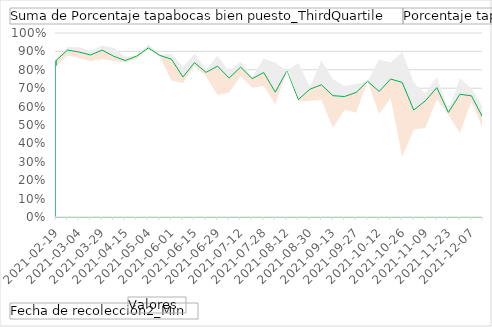
| Category | Suma de Porcentaje tapabocas bien puesto_ThirdQuartile | Porcentaje tapabocas bien puesto. | Suma de Porcentaje tapabocas bien puesto_FirstQuartile |
|---|---|---|---|
| 2021-02-19 | 0.855 | 0.851 | 0.819 |
| 2021-02-23 | 0.924 | 0.907 | 0.878 |
| 2021-03-04 | 0.923 | 0.896 | 0.864 |
| 2021-03-10 | 0.902 | 0.881 | 0.848 |
| 2021-03-29 | 0.93 | 0.907 | 0.86 |
| 2021-04-06 | 0.92 | 0.874 | 0.848 |
| 2021-04-15 | 0.871 | 0.85 | 0.842 |
| 2021-04-20 | 0.877 | 0.875 | 0.859 |
| 2021-05-04 | 0.939 | 0.919 | 0.912 |
| 2021-05-21 | 0.884 | 0.878 | 0.873 |
| 2021-06-01 | 0.887 | 0.858 | 0.742 |
| 2021-06-08 | 0.816 | 0.761 | 0.728 |
| 2021-06-15 | 0.887 | 0.839 | 0.821 |
| 2021-06-21 | 0.802 | 0.786 | 0.765 |
| 2021-06-29 | 0.877 | 0.82 | 0.663 |
| 2021-07-06 | 0.792 | 0.755 | 0.677 |
| 2021-07-12 | 0.844 | 0.815 | 0.767 |
| 2021-07-19 | 0.759 | 0.752 | 0.702 |
| 2021-07-28 | 0.86 | 0.785 | 0.713 |
| 2021-08-03 | 0.839 | 0.679 | 0.613 |
| 2021-08-12 | 0.793 | 0.793 | 0.793 |
| 2021-08-17 | 0.837 | 0.638 | 0.628 |
| 2021-08-30 | 0.706 | 0.695 | 0.632 |
| 2021-09-06 | 0.849 | 0.719 | 0.637 |
| 2021-09-13 | 0.748 | 0.659 | 0.483 |
| 2021-09-20 | 0.712 | 0.655 | 0.583 |
| 2021-09-27 | 0.723 | 0.676 | 0.567 |
| 2021-10-06 | 0.738 | 0.738 | 0.738 |
| 2021-10-12 | 0.855 | 0.682 | 0.56 |
| 2021-10-19 | 0.839 | 0.75 | 0.646 |
| 2021-10-26 | 0.896 | 0.731 | 0.327 |
| 2021-11-02 | 0.729 | 0.581 | 0.476 |
| 2021-11-09 | 0.672 | 0.631 | 0.483 |
| 2021-11-17 | 0.761 | 0.703 | 0.639 |
| 2021-11-23 | 0.581 | 0.568 | 0.556 |
| 2021-11-29 | 0.754 | 0.667 | 0.457 |
| 2021-12-07 | 0.698 | 0.659 | 0.628 |
| 2021-12-13 | 0.599 | 0.539 | 0.478 |